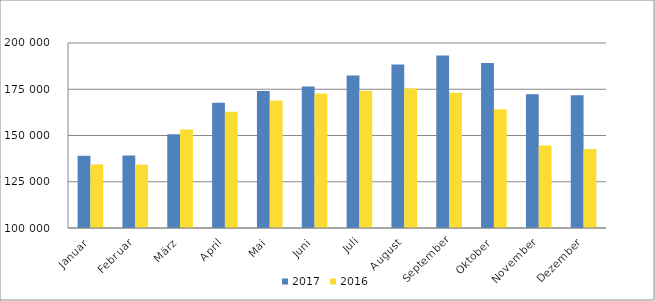
| Category | 2017 | 2016 |
|---|---|---|
| Januar | 139027 | 134392 |
| Februar | 139239 | 134236 |
| März | 150687 | 153180 |
| April | 167713 | 162837 |
| Mai | 174055 | 168879 |
| Juni | 176457 | 172637 |
| Juli | 182393 | 174178 |
| August | 188334 | 175434 |
| September | 193258 | 173135 |
| Oktober | 189228 | 164181 |
| November | 172272 | 144592 |
| Dezember | 171814 | 142758 |